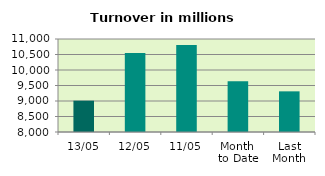
| Category | Series 0 |
|---|---|
| 13/05 | 9010.046 |
| 12/05 | 10549.745 |
| 11/05 | 10807.967 |
| Month 
to Date | 9639.654 |
| Last
Month | 9311.354 |